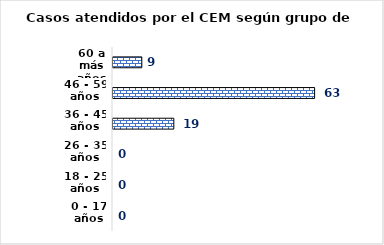
| Category | Series 0 |
|---|---|
| 0 - 17 años | 0 |
| 18 - 25 años | 0 |
| 26 - 35 años | 0 |
| 36 - 45 años | 19 |
| 46 - 59 años | 63 |
| 60 a más años | 9 |